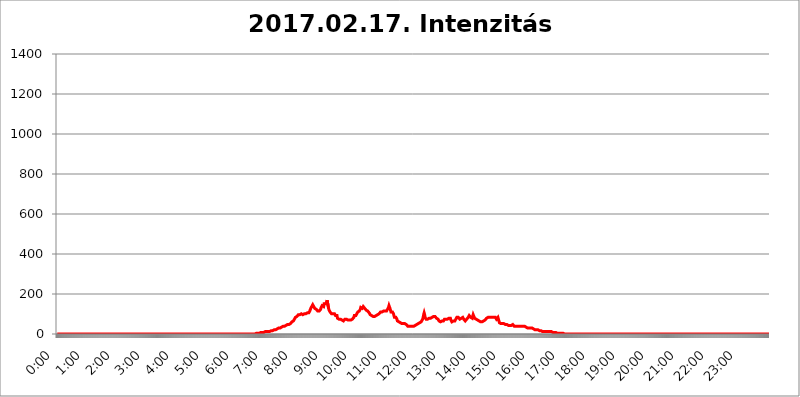
| Category | 2017.02.17. Intenzitás [W/m^2] |
|---|---|
| 0.0 | 0 |
| 0.0006944444444444445 | 0 |
| 0.001388888888888889 | 0 |
| 0.0020833333333333333 | 0 |
| 0.002777777777777778 | 0 |
| 0.003472222222222222 | 0 |
| 0.004166666666666667 | 0 |
| 0.004861111111111111 | 0 |
| 0.005555555555555556 | 0 |
| 0.0062499999999999995 | 0 |
| 0.006944444444444444 | 0 |
| 0.007638888888888889 | 0 |
| 0.008333333333333333 | 0 |
| 0.009027777777777779 | 0 |
| 0.009722222222222222 | 0 |
| 0.010416666666666666 | 0 |
| 0.011111111111111112 | 0 |
| 0.011805555555555555 | 0 |
| 0.012499999999999999 | 0 |
| 0.013194444444444444 | 0 |
| 0.013888888888888888 | 0 |
| 0.014583333333333332 | 0 |
| 0.015277777777777777 | 0 |
| 0.015972222222222224 | 0 |
| 0.016666666666666666 | 0 |
| 0.017361111111111112 | 0 |
| 0.018055555555555557 | 0 |
| 0.01875 | 0 |
| 0.019444444444444445 | 0 |
| 0.02013888888888889 | 0 |
| 0.020833333333333332 | 0 |
| 0.02152777777777778 | 0 |
| 0.022222222222222223 | 0 |
| 0.02291666666666667 | 0 |
| 0.02361111111111111 | 0 |
| 0.024305555555555556 | 0 |
| 0.024999999999999998 | 0 |
| 0.025694444444444447 | 0 |
| 0.02638888888888889 | 0 |
| 0.027083333333333334 | 0 |
| 0.027777777777777776 | 0 |
| 0.02847222222222222 | 0 |
| 0.029166666666666664 | 0 |
| 0.029861111111111113 | 0 |
| 0.030555555555555555 | 0 |
| 0.03125 | 0 |
| 0.03194444444444445 | 0 |
| 0.03263888888888889 | 0 |
| 0.03333333333333333 | 0 |
| 0.034027777777777775 | 0 |
| 0.034722222222222224 | 0 |
| 0.035416666666666666 | 0 |
| 0.036111111111111115 | 0 |
| 0.03680555555555556 | 0 |
| 0.0375 | 0 |
| 0.03819444444444444 | 0 |
| 0.03888888888888889 | 0 |
| 0.03958333333333333 | 0 |
| 0.04027777777777778 | 0 |
| 0.04097222222222222 | 0 |
| 0.041666666666666664 | 0 |
| 0.042361111111111106 | 0 |
| 0.04305555555555556 | 0 |
| 0.043750000000000004 | 0 |
| 0.044444444444444446 | 0 |
| 0.04513888888888889 | 0 |
| 0.04583333333333334 | 0 |
| 0.04652777777777778 | 0 |
| 0.04722222222222222 | 0 |
| 0.04791666666666666 | 0 |
| 0.04861111111111111 | 0 |
| 0.049305555555555554 | 0 |
| 0.049999999999999996 | 0 |
| 0.05069444444444445 | 0 |
| 0.051388888888888894 | 0 |
| 0.052083333333333336 | 0 |
| 0.05277777777777778 | 0 |
| 0.05347222222222222 | 0 |
| 0.05416666666666667 | 0 |
| 0.05486111111111111 | 0 |
| 0.05555555555555555 | 0 |
| 0.05625 | 0 |
| 0.05694444444444444 | 0 |
| 0.057638888888888885 | 0 |
| 0.05833333333333333 | 0 |
| 0.05902777777777778 | 0 |
| 0.059722222222222225 | 0 |
| 0.06041666666666667 | 0 |
| 0.061111111111111116 | 0 |
| 0.06180555555555556 | 0 |
| 0.0625 | 0 |
| 0.06319444444444444 | 0 |
| 0.06388888888888888 | 0 |
| 0.06458333333333334 | 0 |
| 0.06527777777777778 | 0 |
| 0.06597222222222222 | 0 |
| 0.06666666666666667 | 0 |
| 0.06736111111111111 | 0 |
| 0.06805555555555555 | 0 |
| 0.06874999999999999 | 0 |
| 0.06944444444444443 | 0 |
| 0.07013888888888889 | 0 |
| 0.07083333333333333 | 0 |
| 0.07152777777777779 | 0 |
| 0.07222222222222223 | 0 |
| 0.07291666666666667 | 0 |
| 0.07361111111111111 | 0 |
| 0.07430555555555556 | 0 |
| 0.075 | 0 |
| 0.07569444444444444 | 0 |
| 0.0763888888888889 | 0 |
| 0.07708333333333334 | 0 |
| 0.07777777777777778 | 0 |
| 0.07847222222222222 | 0 |
| 0.07916666666666666 | 0 |
| 0.0798611111111111 | 0 |
| 0.08055555555555556 | 0 |
| 0.08125 | 0 |
| 0.08194444444444444 | 0 |
| 0.08263888888888889 | 0 |
| 0.08333333333333333 | 0 |
| 0.08402777777777777 | 0 |
| 0.08472222222222221 | 0 |
| 0.08541666666666665 | 0 |
| 0.08611111111111112 | 0 |
| 0.08680555555555557 | 0 |
| 0.08750000000000001 | 0 |
| 0.08819444444444445 | 0 |
| 0.08888888888888889 | 0 |
| 0.08958333333333333 | 0 |
| 0.09027777777777778 | 0 |
| 0.09097222222222222 | 0 |
| 0.09166666666666667 | 0 |
| 0.09236111111111112 | 0 |
| 0.09305555555555556 | 0 |
| 0.09375 | 0 |
| 0.09444444444444444 | 0 |
| 0.09513888888888888 | 0 |
| 0.09583333333333333 | 0 |
| 0.09652777777777777 | 0 |
| 0.09722222222222222 | 0 |
| 0.09791666666666667 | 0 |
| 0.09861111111111111 | 0 |
| 0.09930555555555555 | 0 |
| 0.09999999999999999 | 0 |
| 0.10069444444444443 | 0 |
| 0.1013888888888889 | 0 |
| 0.10208333333333335 | 0 |
| 0.10277777777777779 | 0 |
| 0.10347222222222223 | 0 |
| 0.10416666666666667 | 0 |
| 0.10486111111111111 | 0 |
| 0.10555555555555556 | 0 |
| 0.10625 | 0 |
| 0.10694444444444444 | 0 |
| 0.1076388888888889 | 0 |
| 0.10833333333333334 | 0 |
| 0.10902777777777778 | 0 |
| 0.10972222222222222 | 0 |
| 0.1111111111111111 | 0 |
| 0.11180555555555556 | 0 |
| 0.11180555555555556 | 0 |
| 0.1125 | 0 |
| 0.11319444444444444 | 0 |
| 0.11388888888888889 | 0 |
| 0.11458333333333333 | 0 |
| 0.11527777777777777 | 0 |
| 0.11597222222222221 | 0 |
| 0.11666666666666665 | 0 |
| 0.1173611111111111 | 0 |
| 0.11805555555555557 | 0 |
| 0.11944444444444445 | 0 |
| 0.12013888888888889 | 0 |
| 0.12083333333333333 | 0 |
| 0.12152777777777778 | 0 |
| 0.12222222222222223 | 0 |
| 0.12291666666666667 | 0 |
| 0.12291666666666667 | 0 |
| 0.12361111111111112 | 0 |
| 0.12430555555555556 | 0 |
| 0.125 | 0 |
| 0.12569444444444444 | 0 |
| 0.12638888888888888 | 0 |
| 0.12708333333333333 | 0 |
| 0.16875 | 0 |
| 0.12847222222222224 | 0 |
| 0.12916666666666668 | 0 |
| 0.12986111111111112 | 0 |
| 0.13055555555555556 | 0 |
| 0.13125 | 0 |
| 0.13194444444444445 | 0 |
| 0.1326388888888889 | 0 |
| 0.13333333333333333 | 0 |
| 0.13402777777777777 | 0 |
| 0.13402777777777777 | 0 |
| 0.13472222222222222 | 0 |
| 0.13541666666666666 | 0 |
| 0.1361111111111111 | 0 |
| 0.13749999999999998 | 0 |
| 0.13819444444444443 | 0 |
| 0.1388888888888889 | 0 |
| 0.13958333333333334 | 0 |
| 0.14027777777777778 | 0 |
| 0.14097222222222222 | 0 |
| 0.14166666666666666 | 0 |
| 0.1423611111111111 | 0 |
| 0.14305555555555557 | 0 |
| 0.14375000000000002 | 0 |
| 0.14444444444444446 | 0 |
| 0.1451388888888889 | 0 |
| 0.1451388888888889 | 0 |
| 0.14652777777777778 | 0 |
| 0.14722222222222223 | 0 |
| 0.14791666666666667 | 0 |
| 0.1486111111111111 | 0 |
| 0.14930555555555555 | 0 |
| 0.15 | 0 |
| 0.15069444444444444 | 0 |
| 0.15138888888888888 | 0 |
| 0.15208333333333332 | 0 |
| 0.15277777777777776 | 0 |
| 0.15347222222222223 | 0 |
| 0.15416666666666667 | 0 |
| 0.15486111111111112 | 0 |
| 0.15555555555555556 | 0 |
| 0.15625 | 0 |
| 0.15694444444444444 | 0 |
| 0.15763888888888888 | 0 |
| 0.15833333333333333 | 0 |
| 0.15902777777777777 | 0 |
| 0.15972222222222224 | 0 |
| 0.16041666666666668 | 0 |
| 0.16111111111111112 | 0 |
| 0.16180555555555556 | 0 |
| 0.1625 | 0 |
| 0.16319444444444445 | 0 |
| 0.1638888888888889 | 0 |
| 0.16458333333333333 | 0 |
| 0.16527777777777777 | 0 |
| 0.16597222222222222 | 0 |
| 0.16666666666666666 | 0 |
| 0.1673611111111111 | 0 |
| 0.16805555555555554 | 0 |
| 0.16874999999999998 | 0 |
| 0.16944444444444443 | 0 |
| 0.17013888888888887 | 0 |
| 0.1708333333333333 | 0 |
| 0.17152777777777775 | 0 |
| 0.17222222222222225 | 0 |
| 0.1729166666666667 | 0 |
| 0.17361111111111113 | 0 |
| 0.17430555555555557 | 0 |
| 0.17500000000000002 | 0 |
| 0.17569444444444446 | 0 |
| 0.1763888888888889 | 0 |
| 0.17708333333333334 | 0 |
| 0.17777777777777778 | 0 |
| 0.17847222222222223 | 0 |
| 0.17916666666666667 | 0 |
| 0.1798611111111111 | 0 |
| 0.18055555555555555 | 0 |
| 0.18125 | 0 |
| 0.18194444444444444 | 0 |
| 0.1826388888888889 | 0 |
| 0.18333333333333335 | 0 |
| 0.1840277777777778 | 0 |
| 0.18472222222222223 | 0 |
| 0.18541666666666667 | 0 |
| 0.18611111111111112 | 0 |
| 0.18680555555555556 | 0 |
| 0.1875 | 0 |
| 0.18819444444444444 | 0 |
| 0.18888888888888888 | 0 |
| 0.18958333333333333 | 0 |
| 0.19027777777777777 | 0 |
| 0.1909722222222222 | 0 |
| 0.19166666666666665 | 0 |
| 0.19236111111111112 | 0 |
| 0.19305555555555554 | 0 |
| 0.19375 | 0 |
| 0.19444444444444445 | 0 |
| 0.1951388888888889 | 0 |
| 0.19583333333333333 | 0 |
| 0.19652777777777777 | 0 |
| 0.19722222222222222 | 0 |
| 0.19791666666666666 | 0 |
| 0.1986111111111111 | 0 |
| 0.19930555555555554 | 0 |
| 0.19999999999999998 | 0 |
| 0.20069444444444443 | 0 |
| 0.20138888888888887 | 0 |
| 0.2020833333333333 | 0 |
| 0.2027777777777778 | 0 |
| 0.2034722222222222 | 0 |
| 0.2041666666666667 | 0 |
| 0.20486111111111113 | 0 |
| 0.20555555555555557 | 0 |
| 0.20625000000000002 | 0 |
| 0.20694444444444446 | 0 |
| 0.2076388888888889 | 0 |
| 0.20833333333333334 | 0 |
| 0.20902777777777778 | 0 |
| 0.20972222222222223 | 0 |
| 0.21041666666666667 | 0 |
| 0.2111111111111111 | 0 |
| 0.21180555555555555 | 0 |
| 0.2125 | 0 |
| 0.21319444444444444 | 0 |
| 0.2138888888888889 | 0 |
| 0.21458333333333335 | 0 |
| 0.2152777777777778 | 0 |
| 0.21597222222222223 | 0 |
| 0.21666666666666667 | 0 |
| 0.21736111111111112 | 0 |
| 0.21805555555555556 | 0 |
| 0.21875 | 0 |
| 0.21944444444444444 | 0 |
| 0.22013888888888888 | 0 |
| 0.22083333333333333 | 0 |
| 0.22152777777777777 | 0 |
| 0.2222222222222222 | 0 |
| 0.22291666666666665 | 0 |
| 0.2236111111111111 | 0 |
| 0.22430555555555556 | 0 |
| 0.225 | 0 |
| 0.22569444444444445 | 0 |
| 0.2263888888888889 | 0 |
| 0.22708333333333333 | 0 |
| 0.22777777777777777 | 0 |
| 0.22847222222222222 | 0 |
| 0.22916666666666666 | 0 |
| 0.2298611111111111 | 0 |
| 0.23055555555555554 | 0 |
| 0.23124999999999998 | 0 |
| 0.23194444444444443 | 0 |
| 0.23263888888888887 | 0 |
| 0.2333333333333333 | 0 |
| 0.2340277777777778 | 0 |
| 0.2347222222222222 | 0 |
| 0.2354166666666667 | 0 |
| 0.23611111111111113 | 0 |
| 0.23680555555555557 | 0 |
| 0.23750000000000002 | 0 |
| 0.23819444444444446 | 0 |
| 0.2388888888888889 | 0 |
| 0.23958333333333334 | 0 |
| 0.24027777777777778 | 0 |
| 0.24097222222222223 | 0 |
| 0.24166666666666667 | 0 |
| 0.2423611111111111 | 0 |
| 0.24305555555555555 | 0 |
| 0.24375 | 0 |
| 0.24444444444444446 | 0 |
| 0.24513888888888888 | 0 |
| 0.24583333333333335 | 0 |
| 0.2465277777777778 | 0 |
| 0.24722222222222223 | 0 |
| 0.24791666666666667 | 0 |
| 0.24861111111111112 | 0 |
| 0.24930555555555556 | 0 |
| 0.25 | 0 |
| 0.25069444444444444 | 0 |
| 0.2513888888888889 | 0 |
| 0.2520833333333333 | 0 |
| 0.25277777777777777 | 0 |
| 0.2534722222222222 | 0 |
| 0.25416666666666665 | 0 |
| 0.2548611111111111 | 0 |
| 0.2555555555555556 | 0 |
| 0.25625000000000003 | 0 |
| 0.2569444444444445 | 0 |
| 0.2576388888888889 | 0 |
| 0.25833333333333336 | 0 |
| 0.2590277777777778 | 0 |
| 0.25972222222222224 | 0 |
| 0.2604166666666667 | 0 |
| 0.2611111111111111 | 0 |
| 0.26180555555555557 | 0 |
| 0.2625 | 0 |
| 0.26319444444444445 | 0 |
| 0.2638888888888889 | 0 |
| 0.26458333333333334 | 0 |
| 0.2652777777777778 | 0 |
| 0.2659722222222222 | 0 |
| 0.26666666666666666 | 0 |
| 0.2673611111111111 | 0 |
| 0.26805555555555555 | 0 |
| 0.26875 | 0 |
| 0.26944444444444443 | 0 |
| 0.2701388888888889 | 0 |
| 0.2708333333333333 | 0 |
| 0.27152777777777776 | 0 |
| 0.2722222222222222 | 0 |
| 0.27291666666666664 | 0 |
| 0.2736111111111111 | 0 |
| 0.2743055555555555 | 0 |
| 0.27499999999999997 | 0 |
| 0.27569444444444446 | 0 |
| 0.27638888888888885 | 0 |
| 0.27708333333333335 | 0 |
| 0.2777777777777778 | 0 |
| 0.27847222222222223 | 3.525 |
| 0.2791666666666667 | 3.525 |
| 0.2798611111111111 | 3.525 |
| 0.28055555555555556 | 3.525 |
| 0.28125 | 3.525 |
| 0.28194444444444444 | 3.525 |
| 0.2826388888888889 | 3.525 |
| 0.2833333333333333 | 3.525 |
| 0.28402777777777777 | 7.887 |
| 0.2847222222222222 | 7.887 |
| 0.28541666666666665 | 7.887 |
| 0.28611111111111115 | 7.887 |
| 0.28680555555555554 | 7.887 |
| 0.28750000000000003 | 7.887 |
| 0.2881944444444445 | 7.887 |
| 0.2888888888888889 | 7.887 |
| 0.28958333333333336 | 7.887 |
| 0.2902777777777778 | 12.257 |
| 0.29097222222222224 | 12.257 |
| 0.2916666666666667 | 12.257 |
| 0.2923611111111111 | 12.257 |
| 0.29305555555555557 | 12.257 |
| 0.29375 | 12.257 |
| 0.29444444444444445 | 12.257 |
| 0.2951388888888889 | 12.257 |
| 0.29583333333333334 | 12.257 |
| 0.2965277777777778 | 12.257 |
| 0.2972222222222222 | 12.257 |
| 0.29791666666666666 | 12.257 |
| 0.2986111111111111 | 12.257 |
| 0.29930555555555555 | 12.257 |
| 0.3 | 16.636 |
| 0.30069444444444443 | 16.636 |
| 0.3013888888888889 | 16.636 |
| 0.3020833333333333 | 16.636 |
| 0.30277777777777776 | 16.636 |
| 0.3034722222222222 | 16.636 |
| 0.30416666666666664 | 21.024 |
| 0.3048611111111111 | 21.024 |
| 0.3055555555555555 | 21.024 |
| 0.30624999999999997 | 21.024 |
| 0.3069444444444444 | 21.024 |
| 0.3076388888888889 | 21.024 |
| 0.30833333333333335 | 25.419 |
| 0.3090277777777778 | 25.419 |
| 0.30972222222222223 | 25.419 |
| 0.3104166666666667 | 29.823 |
| 0.3111111111111111 | 29.823 |
| 0.31180555555555556 | 29.823 |
| 0.3125 | 29.823 |
| 0.31319444444444444 | 29.823 |
| 0.3138888888888889 | 29.823 |
| 0.3145833333333333 | 34.234 |
| 0.31527777777777777 | 34.234 |
| 0.3159722222222222 | 34.234 |
| 0.31666666666666665 | 38.653 |
| 0.31736111111111115 | 38.653 |
| 0.31805555555555554 | 38.653 |
| 0.31875000000000003 | 38.653 |
| 0.3194444444444445 | 38.653 |
| 0.3201388888888889 | 38.653 |
| 0.32083333333333336 | 43.079 |
| 0.3215277777777778 | 43.079 |
| 0.32222222222222224 | 43.079 |
| 0.3229166666666667 | 47.511 |
| 0.3236111111111111 | 47.511 |
| 0.32430555555555557 | 47.511 |
| 0.325 | 47.511 |
| 0.32569444444444445 | 47.511 |
| 0.3263888888888889 | 51.951 |
| 0.32708333333333334 | 51.951 |
| 0.3277777777777778 | 56.398 |
| 0.3284722222222222 | 56.398 |
| 0.32916666666666666 | 60.85 |
| 0.3298611111111111 | 60.85 |
| 0.33055555555555555 | 65.31 |
| 0.33125 | 65.31 |
| 0.33194444444444443 | 69.775 |
| 0.3326388888888889 | 74.246 |
| 0.3333333333333333 | 74.246 |
| 0.3340277777777778 | 83.205 |
| 0.3347222222222222 | 83.205 |
| 0.3354166666666667 | 87.692 |
| 0.3361111111111111 | 87.692 |
| 0.3368055555555556 | 92.184 |
| 0.33749999999999997 | 92.184 |
| 0.33819444444444446 | 96.682 |
| 0.33888888888888885 | 92.184 |
| 0.33958333333333335 | 92.184 |
| 0.34027777777777773 | 96.682 |
| 0.34097222222222223 | 96.682 |
| 0.3416666666666666 | 101.184 |
| 0.3423611111111111 | 101.184 |
| 0.3430555555555555 | 101.184 |
| 0.34375 | 96.682 |
| 0.3444444444444445 | 96.682 |
| 0.3451388888888889 | 96.682 |
| 0.3458333333333334 | 101.184 |
| 0.34652777777777777 | 101.184 |
| 0.34722222222222227 | 101.184 |
| 0.34791666666666665 | 101.184 |
| 0.34861111111111115 | 101.184 |
| 0.34930555555555554 | 101.184 |
| 0.35000000000000003 | 101.184 |
| 0.3506944444444444 | 105.69 |
| 0.3513888888888889 | 105.69 |
| 0.3520833333333333 | 105.69 |
| 0.3527777777777778 | 105.69 |
| 0.3534722222222222 | 110.201 |
| 0.3541666666666667 | 114.716 |
| 0.3548611111111111 | 119.235 |
| 0.35555555555555557 | 128.284 |
| 0.35625 | 132.814 |
| 0.35694444444444445 | 137.347 |
| 0.3576388888888889 | 141.884 |
| 0.35833333333333334 | 146.423 |
| 0.3590277777777778 | 141.884 |
| 0.3597222222222222 | 137.347 |
| 0.36041666666666666 | 132.814 |
| 0.3611111111111111 | 128.284 |
| 0.36180555555555555 | 128.284 |
| 0.3625 | 123.758 |
| 0.36319444444444443 | 123.758 |
| 0.3638888888888889 | 119.235 |
| 0.3645833333333333 | 119.235 |
| 0.3652777777777778 | 114.716 |
| 0.3659722222222222 | 114.716 |
| 0.3666666666666667 | 114.716 |
| 0.3673611111111111 | 114.716 |
| 0.3680555555555556 | 119.235 |
| 0.36874999999999997 | 119.235 |
| 0.36944444444444446 | 123.758 |
| 0.37013888888888885 | 132.814 |
| 0.37083333333333335 | 137.347 |
| 0.37152777777777773 | 141.884 |
| 0.37222222222222223 | 137.347 |
| 0.3729166666666666 | 137.347 |
| 0.3736111111111111 | 137.347 |
| 0.3743055555555555 | 150.964 |
| 0.375 | 150.964 |
| 0.3756944444444445 | 150.964 |
| 0.3763888888888889 | 150.964 |
| 0.3770833333333334 | 146.423 |
| 0.37777777777777777 | 160.056 |
| 0.37847222222222227 | 169.156 |
| 0.37916666666666665 | 173.709 |
| 0.37986111111111115 | 164.605 |
| 0.38055555555555554 | 128.284 |
| 0.38125000000000003 | 119.235 |
| 0.3819444444444444 | 114.716 |
| 0.3826388888888889 | 110.201 |
| 0.3833333333333333 | 110.201 |
| 0.3840277777777778 | 105.69 |
| 0.3847222222222222 | 101.184 |
| 0.3854166666666667 | 101.184 |
| 0.3861111111111111 | 101.184 |
| 0.38680555555555557 | 101.184 |
| 0.3875 | 105.69 |
| 0.38819444444444445 | 105.69 |
| 0.3888888888888889 | 101.184 |
| 0.38958333333333334 | 101.184 |
| 0.3902777777777778 | 92.184 |
| 0.3909722222222222 | 92.184 |
| 0.39166666666666666 | 92.184 |
| 0.3923611111111111 | 92.184 |
| 0.39305555555555555 | 78.722 |
| 0.39375 | 74.246 |
| 0.39444444444444443 | 74.246 |
| 0.3951388888888889 | 74.246 |
| 0.3958333333333333 | 74.246 |
| 0.3965277777777778 | 74.246 |
| 0.3972222222222222 | 74.246 |
| 0.3979166666666667 | 69.775 |
| 0.3986111111111111 | 69.775 |
| 0.3993055555555556 | 69.775 |
| 0.39999999999999997 | 65.31 |
| 0.40069444444444446 | 65.31 |
| 0.40138888888888885 | 65.31 |
| 0.40208333333333335 | 69.775 |
| 0.40277777777777773 | 69.775 |
| 0.40347222222222223 | 74.246 |
| 0.4041666666666666 | 74.246 |
| 0.4048611111111111 | 74.246 |
| 0.4055555555555555 | 74.246 |
| 0.40625 | 69.775 |
| 0.4069444444444445 | 69.775 |
| 0.4076388888888889 | 69.775 |
| 0.4083333333333334 | 69.775 |
| 0.40902777777777777 | 69.775 |
| 0.40972222222222227 | 69.775 |
| 0.41041666666666665 | 65.31 |
| 0.41111111111111115 | 65.31 |
| 0.41180555555555554 | 69.775 |
| 0.41250000000000003 | 69.775 |
| 0.4131944444444444 | 74.246 |
| 0.4138888888888889 | 74.246 |
| 0.4145833333333333 | 78.722 |
| 0.4152777777777778 | 78.722 |
| 0.4159722222222222 | 83.205 |
| 0.4166666666666667 | 92.184 |
| 0.4173611111111111 | 92.184 |
| 0.41805555555555557 | 92.184 |
| 0.41875 | 92.184 |
| 0.41944444444444445 | 96.682 |
| 0.4201388888888889 | 101.184 |
| 0.42083333333333334 | 105.69 |
| 0.4215277777777778 | 110.201 |
| 0.4222222222222222 | 110.201 |
| 0.42291666666666666 | 114.716 |
| 0.4236111111111111 | 114.716 |
| 0.42430555555555555 | 119.235 |
| 0.425 | 123.758 |
| 0.42569444444444443 | 132.814 |
| 0.4263888888888889 | 137.347 |
| 0.4270833333333333 | 132.814 |
| 0.4277777777777778 | 128.284 |
| 0.4284722222222222 | 132.814 |
| 0.4291666666666667 | 137.347 |
| 0.4298611111111111 | 137.347 |
| 0.4305555555555556 | 132.814 |
| 0.43124999999999997 | 128.284 |
| 0.43194444444444446 | 123.758 |
| 0.43263888888888885 | 123.758 |
| 0.43333333333333335 | 119.235 |
| 0.43402777777777773 | 119.235 |
| 0.43472222222222223 | 119.235 |
| 0.4354166666666666 | 114.716 |
| 0.4361111111111111 | 114.716 |
| 0.4368055555555555 | 110.201 |
| 0.4375 | 105.69 |
| 0.4381944444444445 | 101.184 |
| 0.4388888888888889 | 96.682 |
| 0.4395833333333334 | 92.184 |
| 0.44027777777777777 | 92.184 |
| 0.44097222222222227 | 92.184 |
| 0.44166666666666665 | 92.184 |
| 0.44236111111111115 | 87.692 |
| 0.44305555555555554 | 87.692 |
| 0.44375000000000003 | 83.205 |
| 0.4444444444444444 | 87.692 |
| 0.4451388888888889 | 87.692 |
| 0.4458333333333333 | 92.184 |
| 0.4465277777777778 | 92.184 |
| 0.4472222222222222 | 92.184 |
| 0.4479166666666667 | 96.682 |
| 0.4486111111111111 | 96.682 |
| 0.44930555555555557 | 96.682 |
| 0.45 | 101.184 |
| 0.45069444444444445 | 101.184 |
| 0.4513888888888889 | 101.184 |
| 0.45208333333333334 | 101.184 |
| 0.4527777777777778 | 105.69 |
| 0.4534722222222222 | 110.201 |
| 0.45416666666666666 | 110.201 |
| 0.4548611111111111 | 110.201 |
| 0.45555555555555555 | 110.201 |
| 0.45625 | 110.201 |
| 0.45694444444444443 | 110.201 |
| 0.4576388888888889 | 114.716 |
| 0.4583333333333333 | 119.235 |
| 0.4590277777777778 | 119.235 |
| 0.4597222222222222 | 114.716 |
| 0.4604166666666667 | 110.201 |
| 0.4611111111111111 | 110.201 |
| 0.4618055555555556 | 114.716 |
| 0.46249999999999997 | 119.235 |
| 0.46319444444444446 | 123.758 |
| 0.46388888888888885 | 128.284 |
| 0.46458333333333335 | 132.814 |
| 0.46527777777777773 | 141.884 |
| 0.46597222222222223 | 137.347 |
| 0.4666666666666666 | 128.284 |
| 0.4673611111111111 | 119.235 |
| 0.4680555555555555 | 110.201 |
| 0.46875 | 110.201 |
| 0.4694444444444445 | 105.69 |
| 0.4701388888888889 | 110.201 |
| 0.4708333333333334 | 110.201 |
| 0.47152777777777777 | 101.184 |
| 0.47222222222222227 | 92.184 |
| 0.47291666666666665 | 83.205 |
| 0.47361111111111115 | 78.722 |
| 0.47430555555555554 | 83.205 |
| 0.47500000000000003 | 83.205 |
| 0.4756944444444444 | 83.205 |
| 0.4763888888888889 | 74.246 |
| 0.4770833333333333 | 65.31 |
| 0.4777777777777778 | 60.85 |
| 0.4784722222222222 | 65.31 |
| 0.4791666666666667 | 60.85 |
| 0.4798611111111111 | 60.85 |
| 0.48055555555555557 | 56.398 |
| 0.48125 | 56.398 |
| 0.48194444444444445 | 56.398 |
| 0.4826388888888889 | 51.951 |
| 0.48333333333333334 | 51.951 |
| 0.4840277777777778 | 47.511 |
| 0.4847222222222222 | 47.511 |
| 0.48541666666666666 | 51.951 |
| 0.4861111111111111 | 51.951 |
| 0.48680555555555555 | 51.951 |
| 0.4875 | 51.951 |
| 0.48819444444444443 | 47.511 |
| 0.4888888888888889 | 47.511 |
| 0.4895833333333333 | 47.511 |
| 0.4902777777777778 | 43.079 |
| 0.4909722222222222 | 43.079 |
| 0.4916666666666667 | 38.653 |
| 0.4923611111111111 | 38.653 |
| 0.4930555555555556 | 38.653 |
| 0.49374999999999997 | 38.653 |
| 0.49444444444444446 | 38.653 |
| 0.49513888888888885 | 38.653 |
| 0.49583333333333335 | 38.653 |
| 0.49652777777777773 | 38.653 |
| 0.49722222222222223 | 38.653 |
| 0.4979166666666666 | 38.653 |
| 0.4986111111111111 | 38.653 |
| 0.4993055555555555 | 38.653 |
| 0.5 | 38.653 |
| 0.5006944444444444 | 38.653 |
| 0.5013888888888889 | 43.079 |
| 0.5020833333333333 | 43.079 |
| 0.5027777777777778 | 47.511 |
| 0.5034722222222222 | 47.511 |
| 0.5041666666666667 | 47.511 |
| 0.5048611111111111 | 47.511 |
| 0.5055555555555555 | 47.511 |
| 0.50625 | 51.951 |
| 0.5069444444444444 | 56.398 |
| 0.5076388888888889 | 56.398 |
| 0.5083333333333333 | 56.398 |
| 0.5090277777777777 | 56.398 |
| 0.5097222222222222 | 56.398 |
| 0.5104166666666666 | 60.85 |
| 0.5111111111111112 | 65.31 |
| 0.5118055555555555 | 65.31 |
| 0.5125000000000001 | 74.246 |
| 0.5131944444444444 | 83.205 |
| 0.513888888888889 | 96.682 |
| 0.5145833333333333 | 105.69 |
| 0.5152777777777778 | 96.682 |
| 0.5159722222222222 | 83.205 |
| 0.5166666666666667 | 83.205 |
| 0.517361111111111 | 74.246 |
| 0.5180555555555556 | 74.246 |
| 0.5187499999999999 | 74.246 |
| 0.5194444444444445 | 74.246 |
| 0.5201388888888888 | 74.246 |
| 0.5208333333333334 | 78.722 |
| 0.5215277777777778 | 78.722 |
| 0.5222222222222223 | 78.722 |
| 0.5229166666666667 | 78.722 |
| 0.5236111111111111 | 78.722 |
| 0.5243055555555556 | 83.205 |
| 0.525 | 83.205 |
| 0.5256944444444445 | 83.205 |
| 0.5263888888888889 | 83.205 |
| 0.5270833333333333 | 83.205 |
| 0.5277777777777778 | 87.692 |
| 0.5284722222222222 | 87.692 |
| 0.5291666666666667 | 87.692 |
| 0.5298611111111111 | 87.692 |
| 0.5305555555555556 | 83.205 |
| 0.53125 | 83.205 |
| 0.5319444444444444 | 78.722 |
| 0.5326388888888889 | 74.246 |
| 0.5333333333333333 | 74.246 |
| 0.5340277777777778 | 74.246 |
| 0.5347222222222222 | 69.775 |
| 0.5354166666666667 | 65.31 |
| 0.5361111111111111 | 60.85 |
| 0.5368055555555555 | 60.85 |
| 0.5375 | 60.85 |
| 0.5381944444444444 | 56.398 |
| 0.5388888888888889 | 60.85 |
| 0.5395833333333333 | 65.31 |
| 0.5402777777777777 | 69.775 |
| 0.5409722222222222 | 69.775 |
| 0.5416666666666666 | 65.31 |
| 0.5423611111111112 | 69.775 |
| 0.5430555555555555 | 74.246 |
| 0.5437500000000001 | 74.246 |
| 0.5444444444444444 | 74.246 |
| 0.545138888888889 | 74.246 |
| 0.5458333333333333 | 78.722 |
| 0.5465277777777778 | 74.246 |
| 0.5472222222222222 | 74.246 |
| 0.5479166666666667 | 74.246 |
| 0.548611111111111 | 78.722 |
| 0.5493055555555556 | 78.722 |
| 0.5499999999999999 | 83.205 |
| 0.5506944444444445 | 83.205 |
| 0.5513888888888888 | 78.722 |
| 0.5520833333333334 | 69.775 |
| 0.5527777777777778 | 65.31 |
| 0.5534722222222223 | 60.85 |
| 0.5541666666666667 | 65.31 |
| 0.5548611111111111 | 65.31 |
| 0.5555555555555556 | 65.31 |
| 0.55625 | 65.31 |
| 0.5569444444444445 | 65.31 |
| 0.5576388888888889 | 65.31 |
| 0.5583333333333333 | 69.775 |
| 0.5590277777777778 | 74.246 |
| 0.5597222222222222 | 74.246 |
| 0.5604166666666667 | 83.205 |
| 0.5611111111111111 | 83.205 |
| 0.5618055555555556 | 83.205 |
| 0.5625 | 83.205 |
| 0.5631944444444444 | 83.205 |
| 0.5638888888888889 | 78.722 |
| 0.5645833333333333 | 74.246 |
| 0.5652777777777778 | 74.246 |
| 0.5659722222222222 | 74.246 |
| 0.5666666666666667 | 78.722 |
| 0.5673611111111111 | 83.205 |
| 0.5680555555555555 | 83.205 |
| 0.56875 | 83.205 |
| 0.5694444444444444 | 78.722 |
| 0.5701388888888889 | 74.246 |
| 0.5708333333333333 | 74.246 |
| 0.5715277777777777 | 69.775 |
| 0.5722222222222222 | 65.31 |
| 0.5729166666666666 | 65.31 |
| 0.5736111111111112 | 69.775 |
| 0.5743055555555555 | 74.246 |
| 0.5750000000000001 | 74.246 |
| 0.5756944444444444 | 78.722 |
| 0.576388888888889 | 83.205 |
| 0.5770833333333333 | 87.692 |
| 0.5777777777777778 | 92.184 |
| 0.5784722222222222 | 92.184 |
| 0.5791666666666667 | 87.692 |
| 0.579861111111111 | 83.205 |
| 0.5805555555555556 | 78.722 |
| 0.5812499999999999 | 78.722 |
| 0.5819444444444445 | 78.722 |
| 0.5826388888888888 | 87.692 |
| 0.5833333333333334 | 96.682 |
| 0.5840277777777778 | 96.682 |
| 0.5847222222222223 | 92.184 |
| 0.5854166666666667 | 78.722 |
| 0.5861111111111111 | 74.246 |
| 0.5868055555555556 | 74.246 |
| 0.5875 | 74.246 |
| 0.5881944444444445 | 74.246 |
| 0.5888888888888889 | 69.775 |
| 0.5895833333333333 | 69.775 |
| 0.5902777777777778 | 69.775 |
| 0.5909722222222222 | 65.31 |
| 0.5916666666666667 | 65.31 |
| 0.5923611111111111 | 60.85 |
| 0.5930555555555556 | 60.85 |
| 0.59375 | 60.85 |
| 0.5944444444444444 | 60.85 |
| 0.5951388888888889 | 60.85 |
| 0.5958333333333333 | 60.85 |
| 0.5965277777777778 | 60.85 |
| 0.5972222222222222 | 60.85 |
| 0.5979166666666667 | 65.31 |
| 0.5986111111111111 | 65.31 |
| 0.5993055555555555 | 65.31 |
| 0.6 | 69.775 |
| 0.6006944444444444 | 74.246 |
| 0.6013888888888889 | 74.246 |
| 0.6020833333333333 | 78.722 |
| 0.6027777777777777 | 83.205 |
| 0.6034722222222222 | 83.205 |
| 0.6041666666666666 | 83.205 |
| 0.6048611111111112 | 83.205 |
| 0.6055555555555555 | 83.205 |
| 0.6062500000000001 | 83.205 |
| 0.6069444444444444 | 83.205 |
| 0.607638888888889 | 83.205 |
| 0.6083333333333333 | 83.205 |
| 0.6090277777777778 | 83.205 |
| 0.6097222222222222 | 83.205 |
| 0.6104166666666667 | 83.205 |
| 0.611111111111111 | 83.205 |
| 0.6118055555555556 | 83.205 |
| 0.6124999999999999 | 83.205 |
| 0.6131944444444445 | 83.205 |
| 0.6138888888888888 | 87.692 |
| 0.6145833333333334 | 83.205 |
| 0.6152777777777778 | 83.205 |
| 0.6159722222222223 | 74.246 |
| 0.6166666666666667 | 74.246 |
| 0.6173611111111111 | 78.722 |
| 0.6180555555555556 | 83.205 |
| 0.61875 | 78.722 |
| 0.6194444444444445 | 65.31 |
| 0.6201388888888889 | 56.398 |
| 0.6208333333333333 | 51.951 |
| 0.6215277777777778 | 51.951 |
| 0.6222222222222222 | 51.951 |
| 0.6229166666666667 | 51.951 |
| 0.6236111111111111 | 51.951 |
| 0.6243055555555556 | 51.951 |
| 0.625 | 51.951 |
| 0.6256944444444444 | 51.951 |
| 0.6263888888888889 | 51.951 |
| 0.6270833333333333 | 51.951 |
| 0.6277777777777778 | 51.951 |
| 0.6284722222222222 | 47.511 |
| 0.6291666666666667 | 47.511 |
| 0.6298611111111111 | 47.511 |
| 0.6305555555555555 | 47.511 |
| 0.63125 | 43.079 |
| 0.6319444444444444 | 43.079 |
| 0.6326388888888889 | 43.079 |
| 0.6333333333333333 | 43.079 |
| 0.6340277777777777 | 43.079 |
| 0.6347222222222222 | 43.079 |
| 0.6354166666666666 | 43.079 |
| 0.6361111111111112 | 43.079 |
| 0.6368055555555555 | 43.079 |
| 0.6375000000000001 | 43.079 |
| 0.6381944444444444 | 43.079 |
| 0.638888888888889 | 47.511 |
| 0.6395833333333333 | 43.079 |
| 0.6402777777777778 | 43.079 |
| 0.6409722222222222 | 38.653 |
| 0.6416666666666667 | 38.653 |
| 0.642361111111111 | 38.653 |
| 0.6430555555555556 | 38.653 |
| 0.6437499999999999 | 38.653 |
| 0.6444444444444445 | 38.653 |
| 0.6451388888888888 | 38.653 |
| 0.6458333333333334 | 38.653 |
| 0.6465277777777778 | 38.653 |
| 0.6472222222222223 | 38.653 |
| 0.6479166666666667 | 38.653 |
| 0.6486111111111111 | 38.653 |
| 0.6493055555555556 | 38.653 |
| 0.65 | 38.653 |
| 0.6506944444444445 | 38.653 |
| 0.6513888888888889 | 38.653 |
| 0.6520833333333333 | 38.653 |
| 0.6527777777777778 | 38.653 |
| 0.6534722222222222 | 38.653 |
| 0.6541666666666667 | 38.653 |
| 0.6548611111111111 | 38.653 |
| 0.6555555555555556 | 38.653 |
| 0.65625 | 38.653 |
| 0.6569444444444444 | 38.653 |
| 0.6576388888888889 | 34.234 |
| 0.6583333333333333 | 34.234 |
| 0.6590277777777778 | 34.234 |
| 0.6597222222222222 | 29.823 |
| 0.6604166666666667 | 29.823 |
| 0.6611111111111111 | 29.823 |
| 0.6618055555555555 | 29.823 |
| 0.6625 | 29.823 |
| 0.6631944444444444 | 29.823 |
| 0.6638888888888889 | 29.823 |
| 0.6645833333333333 | 29.823 |
| 0.6652777777777777 | 29.823 |
| 0.6659722222222222 | 29.823 |
| 0.6666666666666666 | 29.823 |
| 0.6673611111111111 | 29.823 |
| 0.6680555555555556 | 25.419 |
| 0.6687500000000001 | 21.024 |
| 0.6694444444444444 | 21.024 |
| 0.6701388888888888 | 21.024 |
| 0.6708333333333334 | 21.024 |
| 0.6715277777777778 | 21.024 |
| 0.6722222222222222 | 21.024 |
| 0.6729166666666666 | 21.024 |
| 0.6736111111111112 | 21.024 |
| 0.6743055555555556 | 21.024 |
| 0.6749999999999999 | 21.024 |
| 0.6756944444444444 | 16.636 |
| 0.6763888888888889 | 16.636 |
| 0.6770833333333334 | 16.636 |
| 0.6777777777777777 | 16.636 |
| 0.6784722222222223 | 16.636 |
| 0.6791666666666667 | 16.636 |
| 0.6798611111111111 | 16.636 |
| 0.6805555555555555 | 12.257 |
| 0.68125 | 12.257 |
| 0.6819444444444445 | 12.257 |
| 0.6826388888888889 | 12.257 |
| 0.6833333333333332 | 12.257 |
| 0.6840277777777778 | 12.257 |
| 0.6847222222222222 | 12.257 |
| 0.6854166666666667 | 12.257 |
| 0.686111111111111 | 12.257 |
| 0.6868055555555556 | 12.257 |
| 0.6875 | 12.257 |
| 0.6881944444444444 | 12.257 |
| 0.688888888888889 | 12.257 |
| 0.6895833333333333 | 12.257 |
| 0.6902777777777778 | 12.257 |
| 0.6909722222222222 | 12.257 |
| 0.6916666666666668 | 12.257 |
| 0.6923611111111111 | 12.257 |
| 0.6930555555555555 | 12.257 |
| 0.69375 | 12.257 |
| 0.6944444444444445 | 7.887 |
| 0.6951388888888889 | 7.887 |
| 0.6958333333333333 | 7.887 |
| 0.6965277777777777 | 7.887 |
| 0.6972222222222223 | 7.887 |
| 0.6979166666666666 | 7.887 |
| 0.6986111111111111 | 7.887 |
| 0.6993055555555556 | 7.887 |
| 0.7000000000000001 | 3.525 |
| 0.7006944444444444 | 3.525 |
| 0.7013888888888888 | 3.525 |
| 0.7020833333333334 | 3.525 |
| 0.7027777777777778 | 3.525 |
| 0.7034722222222222 | 3.525 |
| 0.7041666666666666 | 3.525 |
| 0.7048611111111112 | 3.525 |
| 0.7055555555555556 | 3.525 |
| 0.7062499999999999 | 3.525 |
| 0.7069444444444444 | 3.525 |
| 0.7076388888888889 | 3.525 |
| 0.7083333333333334 | 3.525 |
| 0.7090277777777777 | 3.525 |
| 0.7097222222222223 | 3.525 |
| 0.7104166666666667 | 0 |
| 0.7111111111111111 | 0 |
| 0.7118055555555555 | 0 |
| 0.7125 | 0 |
| 0.7131944444444445 | 0 |
| 0.7138888888888889 | 0 |
| 0.7145833333333332 | 0 |
| 0.7152777777777778 | 0 |
| 0.7159722222222222 | 0 |
| 0.7166666666666667 | 0 |
| 0.717361111111111 | 0 |
| 0.7180555555555556 | 0 |
| 0.71875 | 0 |
| 0.7194444444444444 | 0 |
| 0.720138888888889 | 0 |
| 0.7208333333333333 | 0 |
| 0.7215277777777778 | 0 |
| 0.7222222222222222 | 0 |
| 0.7229166666666668 | 0 |
| 0.7236111111111111 | 0 |
| 0.7243055555555555 | 0 |
| 0.725 | 0 |
| 0.7256944444444445 | 0 |
| 0.7263888888888889 | 0 |
| 0.7270833333333333 | 0 |
| 0.7277777777777777 | 0 |
| 0.7284722222222223 | 0 |
| 0.7291666666666666 | 0 |
| 0.7298611111111111 | 0 |
| 0.7305555555555556 | 0 |
| 0.7312500000000001 | 0 |
| 0.7319444444444444 | 0 |
| 0.7326388888888888 | 0 |
| 0.7333333333333334 | 0 |
| 0.7340277777777778 | 0 |
| 0.7347222222222222 | 0 |
| 0.7354166666666666 | 0 |
| 0.7361111111111112 | 0 |
| 0.7368055555555556 | 0 |
| 0.7374999999999999 | 0 |
| 0.7381944444444444 | 0 |
| 0.7388888888888889 | 0 |
| 0.7395833333333334 | 0 |
| 0.7402777777777777 | 0 |
| 0.7409722222222223 | 0 |
| 0.7416666666666667 | 0 |
| 0.7423611111111111 | 0 |
| 0.7430555555555555 | 0 |
| 0.74375 | 0 |
| 0.7444444444444445 | 0 |
| 0.7451388888888889 | 0 |
| 0.7458333333333332 | 0 |
| 0.7465277777777778 | 0 |
| 0.7472222222222222 | 0 |
| 0.7479166666666667 | 0 |
| 0.748611111111111 | 0 |
| 0.7493055555555556 | 0 |
| 0.75 | 0 |
| 0.7506944444444444 | 0 |
| 0.751388888888889 | 0 |
| 0.7520833333333333 | 0 |
| 0.7527777777777778 | 0 |
| 0.7534722222222222 | 0 |
| 0.7541666666666668 | 0 |
| 0.7548611111111111 | 0 |
| 0.7555555555555555 | 0 |
| 0.75625 | 0 |
| 0.7569444444444445 | 0 |
| 0.7576388888888889 | 0 |
| 0.7583333333333333 | 0 |
| 0.7590277777777777 | 0 |
| 0.7597222222222223 | 0 |
| 0.7604166666666666 | 0 |
| 0.7611111111111111 | 0 |
| 0.7618055555555556 | 0 |
| 0.7625000000000001 | 0 |
| 0.7631944444444444 | 0 |
| 0.7638888888888888 | 0 |
| 0.7645833333333334 | 0 |
| 0.7652777777777778 | 0 |
| 0.7659722222222222 | 0 |
| 0.7666666666666666 | 0 |
| 0.7673611111111112 | 0 |
| 0.7680555555555556 | 0 |
| 0.7687499999999999 | 0 |
| 0.7694444444444444 | 0 |
| 0.7701388888888889 | 0 |
| 0.7708333333333334 | 0 |
| 0.7715277777777777 | 0 |
| 0.7722222222222223 | 0 |
| 0.7729166666666667 | 0 |
| 0.7736111111111111 | 0 |
| 0.7743055555555555 | 0 |
| 0.775 | 0 |
| 0.7756944444444445 | 0 |
| 0.7763888888888889 | 0 |
| 0.7770833333333332 | 0 |
| 0.7777777777777778 | 0 |
| 0.7784722222222222 | 0 |
| 0.7791666666666667 | 0 |
| 0.779861111111111 | 0 |
| 0.7805555555555556 | 0 |
| 0.78125 | 0 |
| 0.7819444444444444 | 0 |
| 0.782638888888889 | 0 |
| 0.7833333333333333 | 0 |
| 0.7840277777777778 | 0 |
| 0.7847222222222222 | 0 |
| 0.7854166666666668 | 0 |
| 0.7861111111111111 | 0 |
| 0.7868055555555555 | 0 |
| 0.7875 | 0 |
| 0.7881944444444445 | 0 |
| 0.7888888888888889 | 0 |
| 0.7895833333333333 | 0 |
| 0.7902777777777777 | 0 |
| 0.7909722222222223 | 0 |
| 0.7916666666666666 | 0 |
| 0.7923611111111111 | 0 |
| 0.7930555555555556 | 0 |
| 0.7937500000000001 | 0 |
| 0.7944444444444444 | 0 |
| 0.7951388888888888 | 0 |
| 0.7958333333333334 | 0 |
| 0.7965277777777778 | 0 |
| 0.7972222222222222 | 0 |
| 0.7979166666666666 | 0 |
| 0.7986111111111112 | 0 |
| 0.7993055555555556 | 0 |
| 0.7999999999999999 | 0 |
| 0.8006944444444444 | 0 |
| 0.8013888888888889 | 0 |
| 0.8020833333333334 | 0 |
| 0.8027777777777777 | 0 |
| 0.8034722222222223 | 0 |
| 0.8041666666666667 | 0 |
| 0.8048611111111111 | 0 |
| 0.8055555555555555 | 0 |
| 0.80625 | 0 |
| 0.8069444444444445 | 0 |
| 0.8076388888888889 | 0 |
| 0.8083333333333332 | 0 |
| 0.8090277777777778 | 0 |
| 0.8097222222222222 | 0 |
| 0.8104166666666667 | 0 |
| 0.811111111111111 | 0 |
| 0.8118055555555556 | 0 |
| 0.8125 | 0 |
| 0.8131944444444444 | 0 |
| 0.813888888888889 | 0 |
| 0.8145833333333333 | 0 |
| 0.8152777777777778 | 0 |
| 0.8159722222222222 | 0 |
| 0.8166666666666668 | 0 |
| 0.8173611111111111 | 0 |
| 0.8180555555555555 | 0 |
| 0.81875 | 0 |
| 0.8194444444444445 | 0 |
| 0.8201388888888889 | 0 |
| 0.8208333333333333 | 0 |
| 0.8215277777777777 | 0 |
| 0.8222222222222223 | 0 |
| 0.8229166666666666 | 0 |
| 0.8236111111111111 | 0 |
| 0.8243055555555556 | 0 |
| 0.8250000000000001 | 0 |
| 0.8256944444444444 | 0 |
| 0.8263888888888888 | 0 |
| 0.8270833333333334 | 0 |
| 0.8277777777777778 | 0 |
| 0.8284722222222222 | 0 |
| 0.8291666666666666 | 0 |
| 0.8298611111111112 | 0 |
| 0.8305555555555556 | 0 |
| 0.8312499999999999 | 0 |
| 0.8319444444444444 | 0 |
| 0.8326388888888889 | 0 |
| 0.8333333333333334 | 0 |
| 0.8340277777777777 | 0 |
| 0.8347222222222223 | 0 |
| 0.8354166666666667 | 0 |
| 0.8361111111111111 | 0 |
| 0.8368055555555555 | 0 |
| 0.8375 | 0 |
| 0.8381944444444445 | 0 |
| 0.8388888888888889 | 0 |
| 0.8395833333333332 | 0 |
| 0.8402777777777778 | 0 |
| 0.8409722222222222 | 0 |
| 0.8416666666666667 | 0 |
| 0.842361111111111 | 0 |
| 0.8430555555555556 | 0 |
| 0.84375 | 0 |
| 0.8444444444444444 | 0 |
| 0.845138888888889 | 0 |
| 0.8458333333333333 | 0 |
| 0.8465277777777778 | 0 |
| 0.8472222222222222 | 0 |
| 0.8479166666666668 | 0 |
| 0.8486111111111111 | 0 |
| 0.8493055555555555 | 0 |
| 0.85 | 0 |
| 0.8506944444444445 | 0 |
| 0.8513888888888889 | 0 |
| 0.8520833333333333 | 0 |
| 0.8527777777777777 | 0 |
| 0.8534722222222223 | 0 |
| 0.8541666666666666 | 0 |
| 0.8548611111111111 | 0 |
| 0.8555555555555556 | 0 |
| 0.8562500000000001 | 0 |
| 0.8569444444444444 | 0 |
| 0.8576388888888888 | 0 |
| 0.8583333333333334 | 0 |
| 0.8590277777777778 | 0 |
| 0.8597222222222222 | 0 |
| 0.8604166666666666 | 0 |
| 0.8611111111111112 | 0 |
| 0.8618055555555556 | 0 |
| 0.8624999999999999 | 0 |
| 0.8631944444444444 | 0 |
| 0.8638888888888889 | 0 |
| 0.8645833333333334 | 0 |
| 0.8652777777777777 | 0 |
| 0.8659722222222223 | 0 |
| 0.8666666666666667 | 0 |
| 0.8673611111111111 | 0 |
| 0.8680555555555555 | 0 |
| 0.86875 | 0 |
| 0.8694444444444445 | 0 |
| 0.8701388888888889 | 0 |
| 0.8708333333333332 | 0 |
| 0.8715277777777778 | 0 |
| 0.8722222222222222 | 0 |
| 0.8729166666666667 | 0 |
| 0.873611111111111 | 0 |
| 0.8743055555555556 | 0 |
| 0.875 | 0 |
| 0.8756944444444444 | 0 |
| 0.876388888888889 | 0 |
| 0.8770833333333333 | 0 |
| 0.8777777777777778 | 0 |
| 0.8784722222222222 | 0 |
| 0.8791666666666668 | 0 |
| 0.8798611111111111 | 0 |
| 0.8805555555555555 | 0 |
| 0.88125 | 0 |
| 0.8819444444444445 | 0 |
| 0.8826388888888889 | 0 |
| 0.8833333333333333 | 0 |
| 0.8840277777777777 | 0 |
| 0.8847222222222223 | 0 |
| 0.8854166666666666 | 0 |
| 0.8861111111111111 | 0 |
| 0.8868055555555556 | 0 |
| 0.8875000000000001 | 0 |
| 0.8881944444444444 | 0 |
| 0.8888888888888888 | 0 |
| 0.8895833333333334 | 0 |
| 0.8902777777777778 | 0 |
| 0.8909722222222222 | 0 |
| 0.8916666666666666 | 0 |
| 0.8923611111111112 | 0 |
| 0.8930555555555556 | 0 |
| 0.8937499999999999 | 0 |
| 0.8944444444444444 | 0 |
| 0.8951388888888889 | 0 |
| 0.8958333333333334 | 0 |
| 0.8965277777777777 | 0 |
| 0.8972222222222223 | 0 |
| 0.8979166666666667 | 0 |
| 0.8986111111111111 | 0 |
| 0.8993055555555555 | 0 |
| 0.9 | 0 |
| 0.9006944444444445 | 0 |
| 0.9013888888888889 | 0 |
| 0.9020833333333332 | 0 |
| 0.9027777777777778 | 0 |
| 0.9034722222222222 | 0 |
| 0.9041666666666667 | 0 |
| 0.904861111111111 | 0 |
| 0.9055555555555556 | 0 |
| 0.90625 | 0 |
| 0.9069444444444444 | 0 |
| 0.907638888888889 | 0 |
| 0.9083333333333333 | 0 |
| 0.9090277777777778 | 0 |
| 0.9097222222222222 | 0 |
| 0.9104166666666668 | 0 |
| 0.9111111111111111 | 0 |
| 0.9118055555555555 | 0 |
| 0.9125 | 0 |
| 0.9131944444444445 | 0 |
| 0.9138888888888889 | 0 |
| 0.9145833333333333 | 0 |
| 0.9152777777777777 | 0 |
| 0.9159722222222223 | 0 |
| 0.9166666666666666 | 0 |
| 0.9173611111111111 | 0 |
| 0.9180555555555556 | 0 |
| 0.9187500000000001 | 0 |
| 0.9194444444444444 | 0 |
| 0.9201388888888888 | 0 |
| 0.9208333333333334 | 0 |
| 0.9215277777777778 | 0 |
| 0.9222222222222222 | 0 |
| 0.9229166666666666 | 0 |
| 0.9236111111111112 | 0 |
| 0.9243055555555556 | 0 |
| 0.9249999999999999 | 0 |
| 0.9256944444444444 | 0 |
| 0.9263888888888889 | 0 |
| 0.9270833333333334 | 0 |
| 0.9277777777777777 | 0 |
| 0.9284722222222223 | 0 |
| 0.9291666666666667 | 0 |
| 0.9298611111111111 | 0 |
| 0.9305555555555555 | 0 |
| 0.93125 | 0 |
| 0.9319444444444445 | 0 |
| 0.9326388888888889 | 0 |
| 0.9333333333333332 | 0 |
| 0.9340277777777778 | 0 |
| 0.9347222222222222 | 0 |
| 0.9354166666666667 | 0 |
| 0.936111111111111 | 0 |
| 0.9368055555555556 | 0 |
| 0.9375 | 0 |
| 0.9381944444444444 | 0 |
| 0.938888888888889 | 0 |
| 0.9395833333333333 | 0 |
| 0.9402777777777778 | 0 |
| 0.9409722222222222 | 0 |
| 0.9416666666666668 | 0 |
| 0.9423611111111111 | 0 |
| 0.9430555555555555 | 0 |
| 0.94375 | 0 |
| 0.9444444444444445 | 0 |
| 0.9451388888888889 | 0 |
| 0.9458333333333333 | 0 |
| 0.9465277777777777 | 0 |
| 0.9472222222222223 | 0 |
| 0.9479166666666666 | 0 |
| 0.9486111111111111 | 0 |
| 0.9493055555555556 | 0 |
| 0.9500000000000001 | 0 |
| 0.9506944444444444 | 0 |
| 0.9513888888888888 | 0 |
| 0.9520833333333334 | 0 |
| 0.9527777777777778 | 0 |
| 0.9534722222222222 | 0 |
| 0.9541666666666666 | 0 |
| 0.9548611111111112 | 0 |
| 0.9555555555555556 | 0 |
| 0.9562499999999999 | 0 |
| 0.9569444444444444 | 0 |
| 0.9576388888888889 | 0 |
| 0.9583333333333334 | 0 |
| 0.9590277777777777 | 0 |
| 0.9597222222222223 | 0 |
| 0.9604166666666667 | 0 |
| 0.9611111111111111 | 0 |
| 0.9618055555555555 | 0 |
| 0.9625 | 0 |
| 0.9631944444444445 | 0 |
| 0.9638888888888889 | 0 |
| 0.9645833333333332 | 0 |
| 0.9652777777777778 | 0 |
| 0.9659722222222222 | 0 |
| 0.9666666666666667 | 0 |
| 0.967361111111111 | 0 |
| 0.9680555555555556 | 0 |
| 0.96875 | 0 |
| 0.9694444444444444 | 0 |
| 0.970138888888889 | 0 |
| 0.9708333333333333 | 0 |
| 0.9715277777777778 | 0 |
| 0.9722222222222222 | 0 |
| 0.9729166666666668 | 0 |
| 0.9736111111111111 | 0 |
| 0.9743055555555555 | 0 |
| 0.975 | 0 |
| 0.9756944444444445 | 0 |
| 0.9763888888888889 | 0 |
| 0.9770833333333333 | 0 |
| 0.9777777777777777 | 0 |
| 0.9784722222222223 | 0 |
| 0.9791666666666666 | 0 |
| 0.9798611111111111 | 0 |
| 0.9805555555555556 | 0 |
| 0.9812500000000001 | 0 |
| 0.9819444444444444 | 0 |
| 0.9826388888888888 | 0 |
| 0.9833333333333334 | 0 |
| 0.9840277777777778 | 0 |
| 0.9847222222222222 | 0 |
| 0.9854166666666666 | 0 |
| 0.9861111111111112 | 0 |
| 0.9868055555555556 | 0 |
| 0.9874999999999999 | 0 |
| 0.9881944444444444 | 0 |
| 0.9888888888888889 | 0 |
| 0.9895833333333334 | 0 |
| 0.9902777777777777 | 0 |
| 0.9909722222222223 | 0 |
| 0.9916666666666667 | 0 |
| 0.9923611111111111 | 0 |
| 0.9930555555555555 | 0 |
| 0.99375 | 0 |
| 0.9944444444444445 | 0 |
| 0.9951388888888889 | 0 |
| 0.9958333333333332 | 0 |
| 0.9965277777777778 | 0 |
| 0.9972222222222222 | 0 |
| 0.9979166666666667 | 0 |
| 0.998611111111111 | 0 |
| 0.9993055555555556 | 0 |